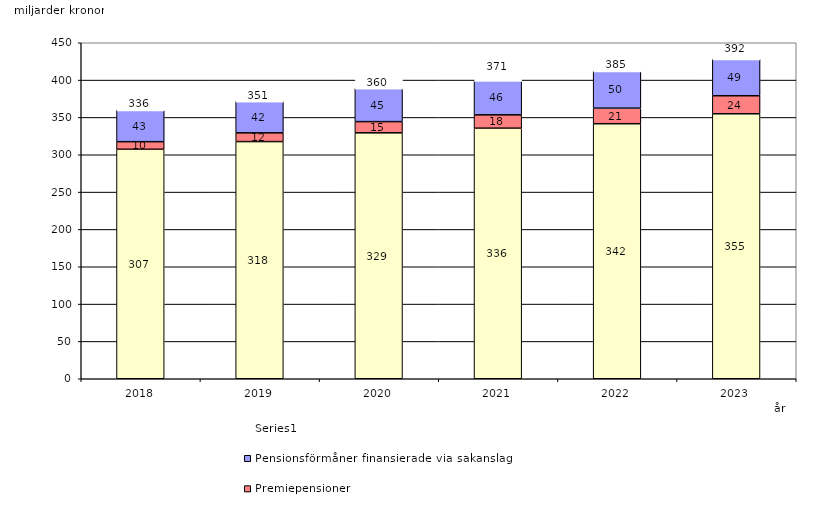
| Category | Inkomstpension och tilläggspension m.m. | Premiepensioner | Pensionsförmåner finansierade via sakanslag | Series 0 |
|---|---|---|---|---|
| 2018.0 | 307.356 | 10.141 | 42.55 | 20 |
| 2019.0 | 317.628 | 11.715 | 42.22 | 20 |
| 2020.0 | 329.365 | 15.016 | 44.546 | 20 |
| 2021.0 | 335.587 | 17.869 | 46.039 | 20 |
| 2022.0 | 341.563 | 20.844 | 49.728 | 20 |
| 2023.0 | 354.893 | 24.13 | 49.321 | 20 |